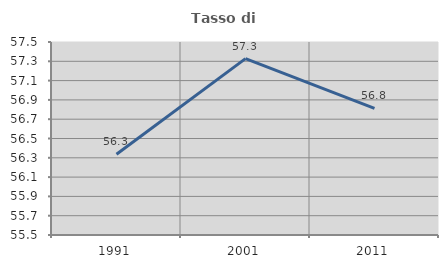
| Category | Tasso di occupazione   |
|---|---|
| 1991.0 | 56.336 |
| 2001.0 | 57.328 |
| 2011.0 | 56.813 |